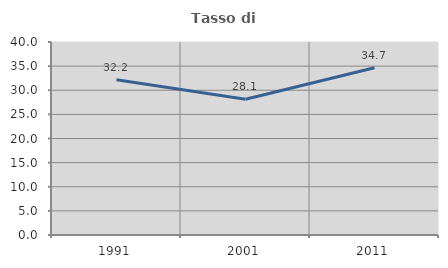
| Category | Tasso di occupazione   |
|---|---|
| 1991.0 | 32.184 |
| 2001.0 | 28.127 |
| 2011.0 | 34.666 |